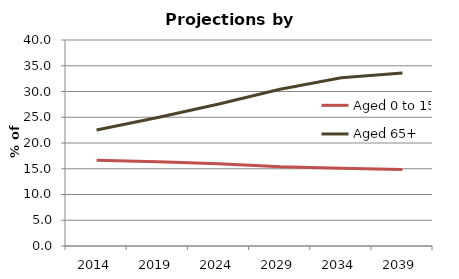
| Category | Aged 0 to 15 | Aged 65+ |
|---|---|---|
| 2014.0 | 16.637 | 22.515 |
| 2019.0 | 16.338 | 24.969 |
| 2024.0 | 15.962 | 27.577 |
| 2029.0 | 15.385 | 30.449 |
| 2034.0 | 15.094 | 32.662 |
| 2039.0 | 14.84 | 33.599 |